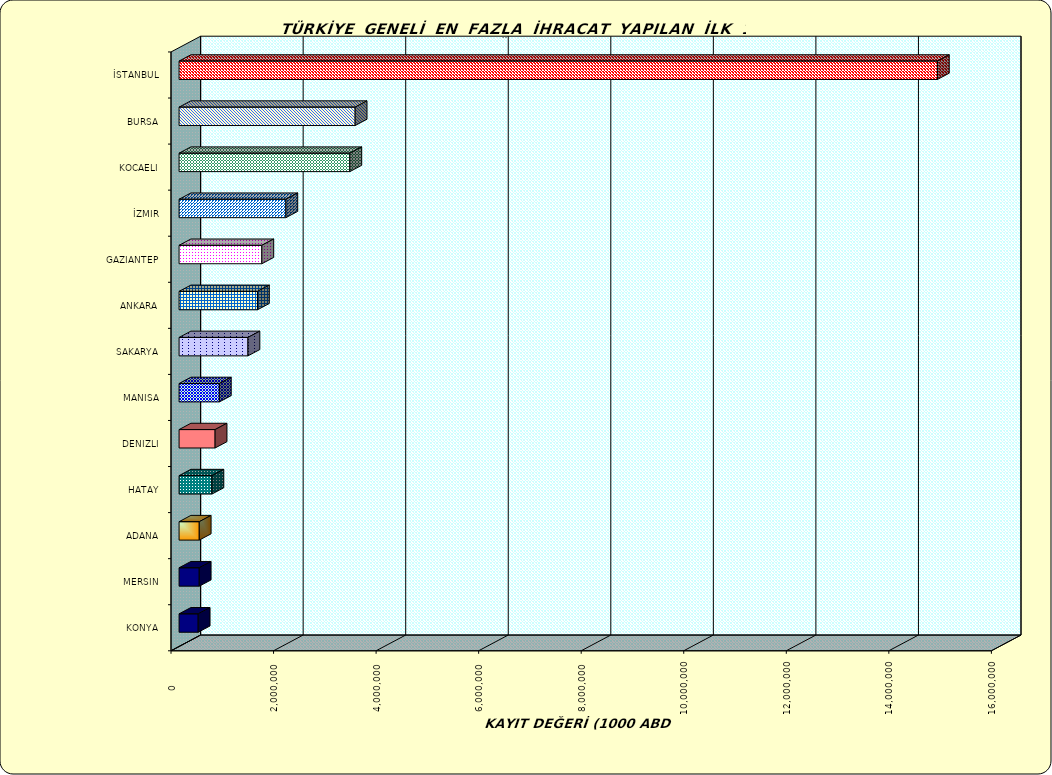
| Category | Series 0 |
|---|---|
| İSTANBUL | 14789773.775 |
| BURSA | 3434188.32 |
| KOCAELI | 3330634.51 |
| İZMIR | 2082758.486 |
| GAZIANTEP | 1614322.502 |
| ANKARA | 1529126.548 |
| SAKARYA | 1343317.09 |
| MANISA | 785682.156 |
| DENIZLI | 702696.499 |
| HATAY | 640771.39 |
| ADANA | 393452.156 |
| MERSIN | 393159.898 |
| KONYA | 372930.644 |